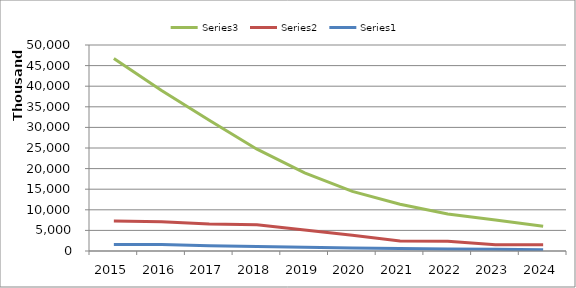
| Category | Series 2 | Series 1 | Series 0 |
|---|---|---|---|
| 2015.0 | 46748988 | 7257181 | 1584150 |
| 2016.0 | 38964903 | 7129323 | 1600000 |
| 2017.0 | 31752865 | 6557276 | 1300000 |
| 2018.0 | 24707174 | 6390929 | 1100000 |
| 2019.0 | 18944136 | 5108276 | 900000 |
| 2020.0 | 14454762 | 3834612 | 700000 |
| 2021.0 | 11350000 | 2450000 | 600000 |
| 2022.0 | 9000000 | 2350000 | 500000 |
| 2023.0 | 7500000 | 1500000 | 400000 |
| 2024.0 | 6000000 | 1500000 | 300000 |